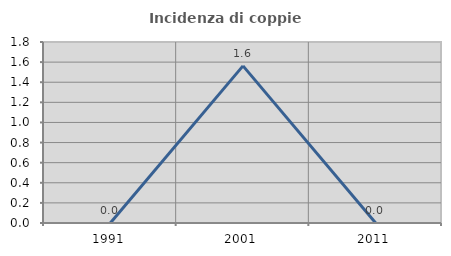
| Category | Incidenza di coppie miste |
|---|---|
| 1991.0 | 0 |
| 2001.0 | 1.562 |
| 2011.0 | 0 |